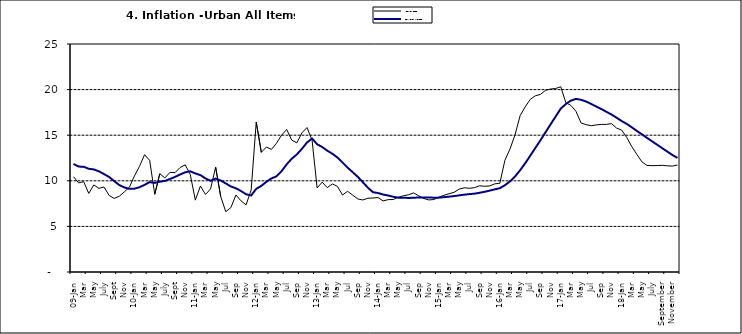
| Category | Year-on Rate | 12-Month Average |
|---|---|---|
| 09-Jan | 10.439 | 11.844 |
| Feb | 9.772 | 11.562 |
| Mar | 9.907 | 11.538 |
| Apr | 8.618 | 11.319 |
| May | 9.547 | 11.246 |
| June | 9.17 | 11.039 |
| July | 9.325 | 10.738 |
| Aug | 8.401 | 10.424 |
| Sept | 8.07 | 9.973 |
| Oct | 8.3 | 9.535 |
| Nov | 8.781 | 9.278 |
| Dec | 9.298 | 9.117 |
| 10-Jan | 10.534 | 9.136 |
| Feb | 11.584 | 9.297 |
| Mar | 12.864 | 9.555 |
| Apr | 12.24 | 9.859 |
| May | 8.524 | 9.769 |
| June | 10.781 | 9.904 |
| July | 10.313 | 9.987 |
| Aug | 10.924 | 10.197 |
| Sept | 10.891 | 10.43 |
| Oct | 11.457 | 10.689 |
| Nov | 11.748 | 10.932 |
| Dec | 10.699 | 11.042 |
| 11-Jan | 7.878 | 10.806 |
| Feb | 9.426 | 10.623 |
| Mar | 8.498 | 10.26 |
| Apr | 9.11 | 10.005 |
| May | 11.5 | 10.249 |
| Jun | 8.278 | 10.034 |
| Jul | 6.608 | 9.711 |
| Aug | 7.061 | 9.38 |
| Sep | 8.443 | 9.178 |
| Oct | 7.802 | 8.88 |
| Nov | 7.365 | 8.525 |
| Dec | 8.993 | 8.395 |
| 12-Jan | 16.445 | 9.119 |
| Feb | 13.123 | 9.443 |
| Mar | 13.701 | 9.889 |
| Apr | 13.447 | 10.259 |
| May | 14.127 | 10.496 |
| Jun | 15.012 | 11.062 |
| Jul | 15.63 | 11.81 |
| Aug | 14.456 | 12.422 |
| Sep | 14.162 | 12.893 |
| Oct | 15.26 | 13.506 |
| Nov | 15.836 | 14.199 |
| Dec | 14.459 | 14.637 |
| 13-Jan | 9.22 | 14.006 |
| Feb | 9.85 | 13.703 |
| Mar | 9.253 | 13.302 |
| Apr | 9.657 | 12.966 |
| May | 9.385 | 12.557 |
| Jun | 8.441 | 11.999 |
| Jul | 8.849 | 11.443 |
| Aug | 8.431 | 10.946 |
| Sep | 8.013 | 10.44 |
| Oct | 7.9 | 9.849 |
| Nov | 8.086 | 9.245 |
| Dec | 8.117 | 8.75 |
| 14-Jan | 8.164 | 8.662 |
| Feb | 7.791 | 8.493 |
| Mar | 7.937 | 8.384 |
| Apr | 7.947 | 8.246 |
| May | 8.195 | 8.151 |
| Jun | 8.358 | 8.146 |
| Jul | 8.464 | 8.118 |
| Aug | 8.673 | 8.141 |
| Sep | 8.357 | 8.17 |
| Oct | 8.064 | 8.182 |
| Nov | 7.902 | 8.165 |
| Dec | 7.948 | 8.151 |
| 15-Jan | 8.211 | 8.155 |
| Feb | 8.412 | 8.206 |
| Mar | 8.579 | 8.26 |
| Apr | 8.742 | 8.326 |
| May | 9.092 | 8.403 |
| Jun | 9.232 | 8.478 |
| Jul | 9.177 | 8.54 |
| Aug | 9.25 | 8.591 |
| Sep | 9.455 | 8.684 |
| Oct | 9.398 | 8.795 |
| Nov | 9.442 | 8.922 |
| Dec | 9.665 | 9.064 |
| 16-Jan | 9.728 | 9.19 |
| Feb | 12.254 | 9.516 |
| Mar | 13.485 | 9.935 |
| Apr | 15.052 | 10.474 |
| May | 17.148 | 11.165 |
| Jun | 18.111 | 11.925 |
| Jul | 18.927 | 12.754 |
| Aug | 19.325 | 13.605 |
| Sep | 19.476 | 14.444 |
| Oct | 19.914 | 15.318 |
| Nov | 20.067 | 16.193 |
| Dec | 20.118 | 17.05 |
| 17-Jan | 20.315 | 17.914 |
| Feb | 18.569 | 18.418 |
| Mar | 18.27 | 18.794 |
| Apr | 17.621 | 18.982 |
| May | 16.343 | 18.883 |
| Jun | 16.153 | 18.692 |
| Jul | 16.038 | 18.43 |
| Aug | 16.128 | 18.151 |
| Sep | 16.183 | 17.872 |
| Oct | 16.187 | 17.567 |
| Nov | 16.267 | 17.264 |
| Dec | 15.785 | 16.921 |
| 18-Jan | 15.559 | 16.55 |
| Feb | 14.763 | 16.241 |
| Mar | 13.748 | 15.866 |
| Apr | 12.893 | 15.468 |
| May | 12.077 | 15.096 |
| June | 11.683 | 14.706 |
| July | 11.661 | 14.329 |
| August | 11.673 | 13.951 |
| September | 11.697 | 13.578 |
| October | 11.64 | 13.206 |
| November | 11.615 | 12.831 |
| December | 11.731 | 12.509 |